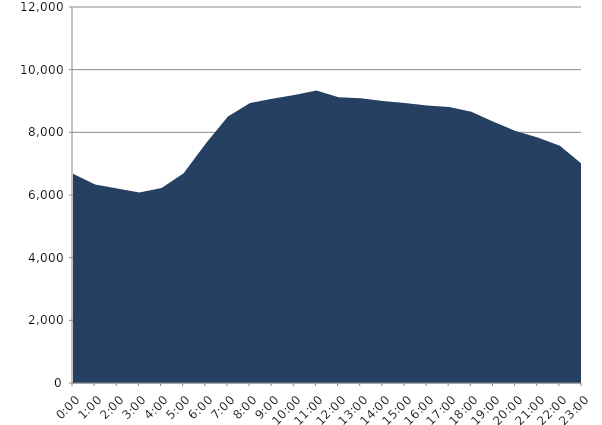
| Category | Series 0 | Series 1 |
|---|---|---|
| 2018-07-18 |  | 6681.15 |
| 2018-07-18 01:00:00 |  | 6331.24 |
| 2018-07-18 02:00:00 |  | 6203.47 |
| 2018-07-18 03:00:00 |  | 6076.45 |
| 2018-07-18 04:00:00 |  | 6223.6 |
| 2018-07-18 05:00:00 |  | 6691.36 |
| 2018-07-18 06:00:00 |  | 7643.35 |
| 2018-07-18 07:00:00 |  | 8505.51 |
| 2018-07-18 08:00:00 |  | 8932.56 |
| 2018-07-18 09:00:00 |  | 9073.77 |
| 2018-07-18 10:00:00 |  | 9190.11 |
| 2018-07-18 11:00:00 |  | 9337.06 |
| 2018-07-18 12:00:00 |  | 9116.67 |
| 2018-07-18 13:00:00 |  | 9086.47 |
| 2018-07-18 14:00:00 |  | 9000.59 |
| 2018-07-18 15:00:00 |  | 8933.57 |
| 2018-07-18 16:00:00 |  | 8855.57 |
| 2018-07-18 17:00:00 |  | 8805.81 |
| 2018-07-18 18:00:00 |  | 8658.05 |
| 2018-07-18 19:00:00 |  | 8334.9 |
| 2018-07-18 20:00:00 |  | 8043.5 |
| 2018-07-18 21:00:00 |  | 7835.99 |
| 2018-07-18 22:00:00 |  | 7575.06 |
| 2018-07-18 23:00:00 |  | 6983.6 |